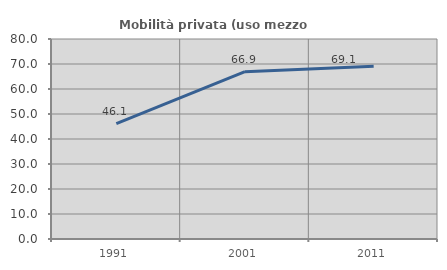
| Category | Mobilità privata (uso mezzo privato) |
|---|---|
| 1991.0 | 46.136 |
| 2001.0 | 66.947 |
| 2011.0 | 69.088 |